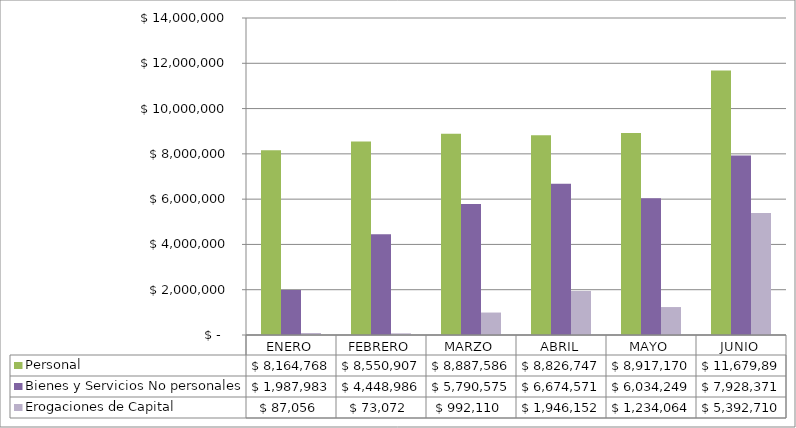
| Category | Personal | Bienes y Servicios No personales | Erogaciones de Capital |
|---|---|---|---|
| ENERO | 8164768.09 | 1987983.05 | 87056.01 |
| FEBRERO | 8550906.62 | 4448985.53 | 73072.38 |
| MARZO | 8887585.94 | 5790575.49 | 992110 |
| ABRIL | 8826747.06 | 6674571.42 | 1946151.99 |
| MAYO | 8917169.81 | 6034248.52 | 1234063.95 |
| JUNIO | 11679895.92 | 7928370.55 | 5392710.39 |